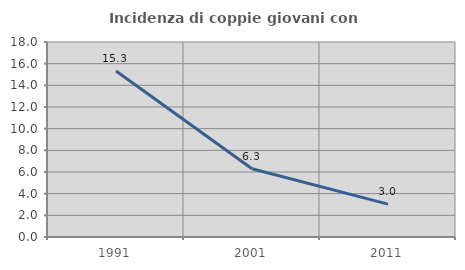
| Category | Incidenza di coppie giovani con figli |
|---|---|
| 1991.0 | 15.323 |
| 2001.0 | 6.306 |
| 2011.0 | 3.03 |